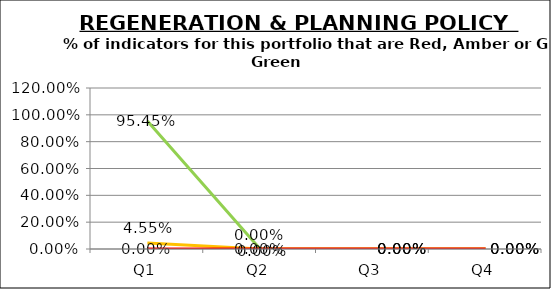
| Category | Green | Amber | Red |
|---|---|---|---|
| Q1 | 0.955 | 0.045 | 0 |
| Q2 | 0 | 0 | 0 |
| Q3 | 0 | 0 | 0 |
| Q4 | 0 | 0 | 0 |